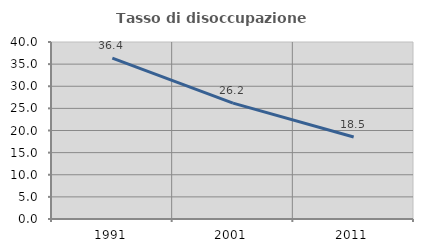
| Category | Tasso di disoccupazione giovanile  |
|---|---|
| 1991.0 | 36.364 |
| 2001.0 | 26.19 |
| 2011.0 | 18.519 |